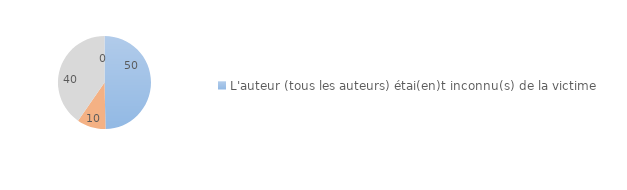
| Category | Series 0 |
|---|---|
| L'auteur (tous les auteurs) étai(en)t inconnu(s) de la victime | 49.644 |
| L'auteur (au moins un auteur) était connu de vue ou personnellement  | 9.991 |
| Ne sait pas/Refus | 40.365 |